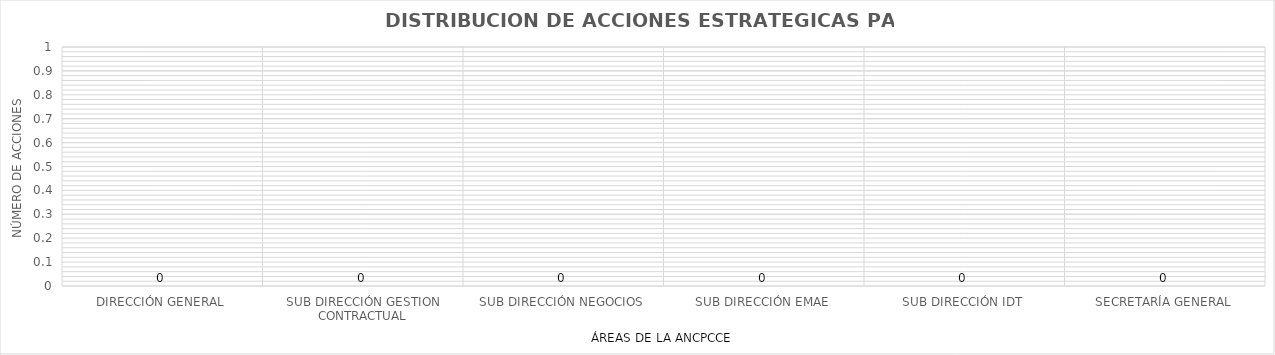
| Category | Series 0 |
|---|---|
| DIRECCIÓN GENERAL | 0 |
| SUB DIRECCIÓN GESTION CONTRACTUAL | 0 |
| SUB DIRECCIÓN NEGOCIOS | 0 |
| SUB DIRECCIÓN EMAE | 0 |
| SUB DIRECCIÓN IDT | 0 |
| SECRETARÍA GENERAL | 0 |